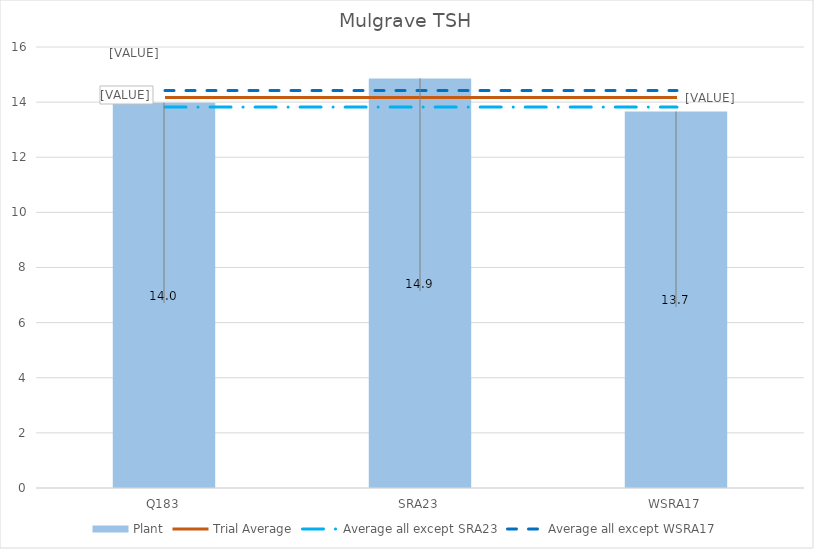
| Category | Plant |
|---|---|
| Q183 | 13.979 |
| SRA23 | 14.861 |
| WSRA17 | 13.661 |